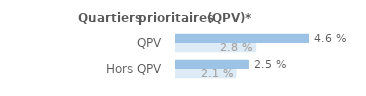
| Category | Series 1 | Series 0 |
|---|---|---|
| QPV | 0.046 | 0.028 |
| Hors QPV | 0.025 | 0.021 |